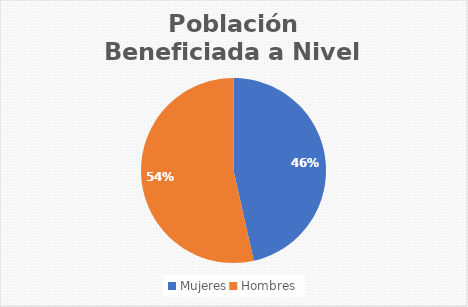
| Category | Series 0 |
|---|---|
| Mujeres | 687 |
| Hombres | 791 |